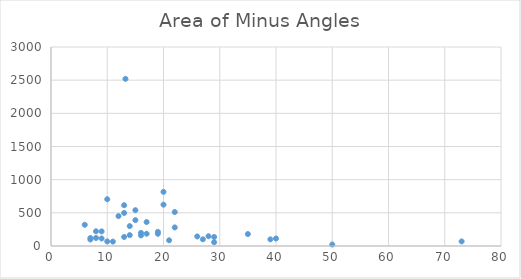
| Category | Area |
|---|---|
| 13.24 | 2520 |
| 16.0 | 197.7 |
| 7.0 | 120 |
| 16.0 | 160 |
| 40.0 | 113 |
| 8.0 | 222 |
| 11.0 | 66 |
| 22.0 | 280 |
| 21.0 | 86 |
| 14.0 | 164 |
| 29.0 | 136 |
| 29.0 | 57 |
| 17.0 | 185 |
| 12.0 | 451 |
| 15.0 | 540 |
| 14.0 | 300 |
| 10.0 | 69 |
| 50.0 | 22 |
| 19.0 | 184 |
| 28.0 | 147 |
| 26.0 | 144 |
| 6.0 | 320 |
| 9.0 | 220 |
| 73.0 | 69 |
| 9.0 | 113 |
| 13.0 | 136 |
| 20.0 | 623 |
| 19.0 | 213 |
| 8.0 | 121 |
| 13.0 | 615 |
| 35.0 | 180 |
| 7.0 | 98 |
| 22.0 | 512 |
| 20.0 | 816 |
| 10.0 | 705 |
| 13.0 | 498 |
| 27.0 | 101 |
| 15.0 | 390 |
| 39.0 | 100 |
| 17.0 | 361 |